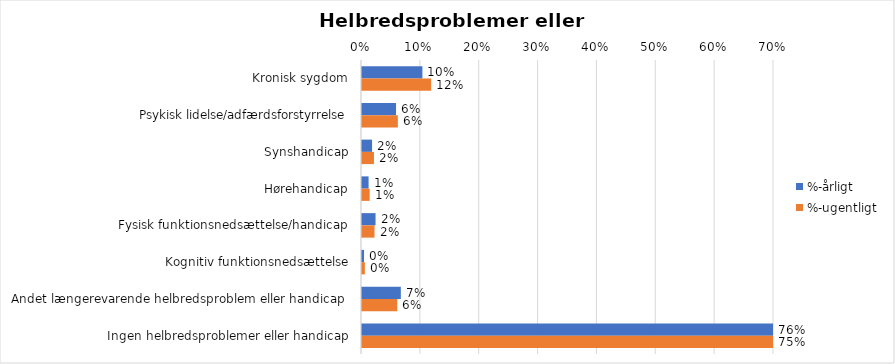
| Category | %-årligt | %-ugentligt |
|---|---|---|
| Kronisk sygdom | 0.103 | 0.117 |
| Psykisk lidelse/adfærdsforstyrrelse | 0.058 | 0.061 |
| Synshandicap | 0.017 | 0.02 |
| Hørehandicap | 0.011 | 0.013 |
| Fysisk funktionsnedsættelse/handicap | 0.023 | 0.021 |
| Kognitiv funktionsnedsættelse | 0.003 | 0.005 |
| Andet længerevarende helbredsproblem eller handicap  | 0.066 | 0.06 |
| Ingen helbredsproblemer eller handicap | 0.763 | 0.753 |